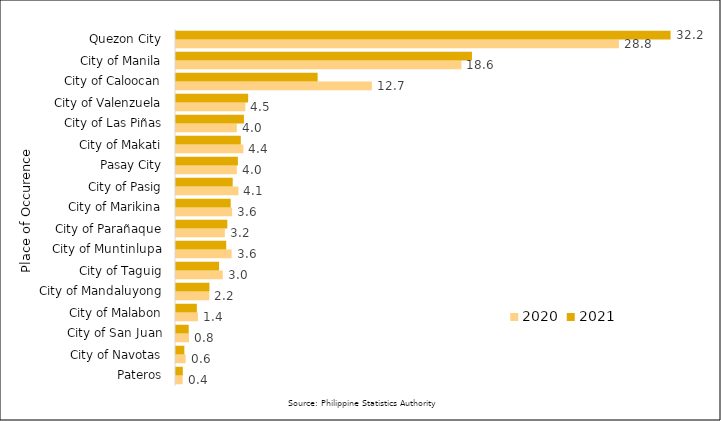
| Category | 2020 | 2021 |
|---|---|---|
|  Pateros | 0.434 | 0.444 |
|  City of Navotas | 0.63 | 0.544 |
|  City of San Juan | 0.847 | 0.826 |
|  City of Malabon | 1.429 | 1.358 |
|  City of Mandaluyong | 2.169 | 2.177 |
|  City of Taguig | 3.044 | 2.803 |
|  City of Muntinlupa | 3.619 | 3.266 |
|  City of Parañaque | 3.178 | 3.339 |
|  City of Marikina | 3.646 | 3.559 |
|  City of Pasig | 4.066 | 3.688 |
|  Pasay City | 3.955 | 4.027 |
|  City of Makati | 4.384 | 4.215 |
|  City of Las Piñas | 3.959 | 4.419 |
|  City of Valenzuela | 4.512 | 4.692 |
|  City of Caloocan | 12.741 | 9.214 |
|  City of Manila | 18.569 | 19.254 |
|  Quezon City | 28.817 | 32.176 |